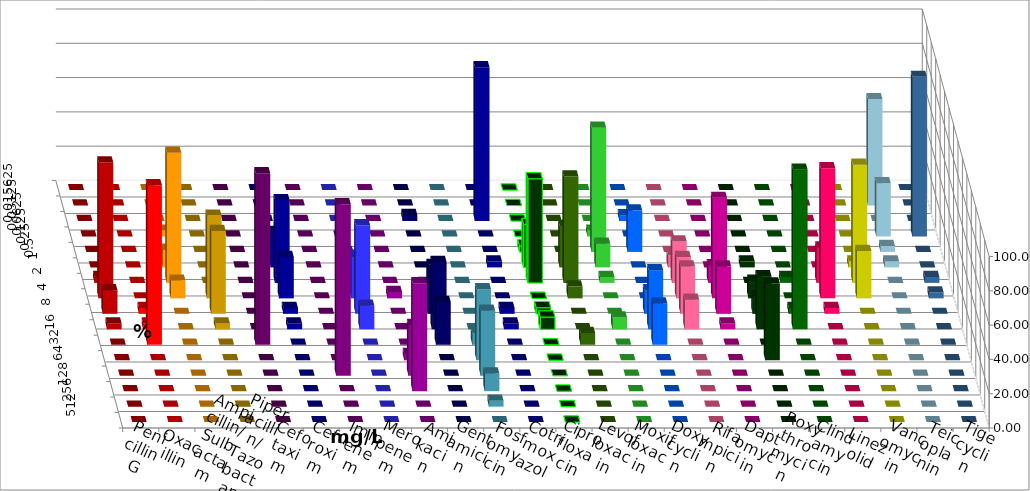
| Category | Penicillin G | Oxacillin | Ampicillin/ Sulbactam | Piperacillin/ Tazobactam | Cefotaxim | Cefuroxim | Imipenem | Meropenem | Amikacin | Gentamicin | Fosfomycin | Cotrimoxazol | Ciprofloxacin | Levofloxacin | Moxifloxacin | Doxycyclin | Rifampicin | Daptomycin | Roxythromycin | Clindamycin | Linezolid | Vancomycin | Teicoplanin | Tigecyclin |
|---|---|---|---|---|---|---|---|---|---|---|---|---|---|---|---|---|---|---|---|---|---|---|---|---|
| 0.015625 | 0 | 0 | 0 | 0 | 0 | 0 | 0 | 0 | 0 | 0 | 0 | 0 | 0 | 0 | 0 | 0 | 0 | 0 | 0 | 0 | 0 | 0 | 0 | 0 |
| 0.03125 | 0 | 0 | 0 | 0 | 0 | 0 | 0 | 0 | 0 | 0 | 0 | 0 | 0 | 0 | 0 | 0 | 0 | 0 | 0 | 0 | 0 | 0 | 0 | 62.069 |
| 0.0625 | 0 | 0 | 0 | 0 | 0 | 0 | 0 | 0 | 0 | 3.571 | 0 | 89.655 | 0 | 0 | 0 | 3.448 | 0 | 0 | 0 | 0 | 0 | 0 | 0 | 0 |
| 0.125 | 0 | 0 | 3.448 | 0 | 0 | 0 | 0 | 0 | 0 | 0 | 0 | 0 | 0 | 0 | 3.448 | 0 | 0 | 0 | 0 | 0 | 0 | 0 | 93.103 | 31.034 |
| 0.25 | 0 | 0 | 0 | 0 | 0 | 0 | 0 | 0 | 0 | 0 | 0 | 0 | 3.571 | 0 | 72.414 | 24.138 | 0 | 0 | 0 | 0 | 0 | 0 | 0 | 3.448 |
| 0.5 | 0 | 0 | 10.345 | 0 | 0 | 0 | 20.69 | 6.897 | 0 | 0 | 0 | 3.448 | 25 | 24.138 | 13.793 | 0 | 6.897 | 0 | 3.448 | 0 | 0 | 3.448 | 0 | 3.448 |
| 1.0 | 3.448 | 0 | 75.862 | 0 | 0 | 0 | 48.276 | 3.448 | 0 | 0 | 0 | 0 | 60.714 | 62.069 | 3.448 | 0 | 24.138 | 10.345 | 0 | 3.448 | 20.69 | 68.966 | 3.448 | 0 |
| 2.0 | 79.31 | 0 | 10.345 | 48.276 | 0 | 0 | 24.138 | 24.138 | 3.704 | 3.571 | 0 | 0 | 0 | 6.897 | 0 | 0 | 24.138 | 58.621 | 10.345 | 0 | 75.862 | 27.586 | 3.448 | 0 |
| 4.0 | 13.793 | 3.448 | 0 | 48.276 | 0 | 0 | 3.448 | 51.724 | 0 | 28.571 | 0 | 3.448 | 3.571 | 0 | 0 | 13.793 | 27.586 | 27.586 | 10.345 | 3.448 | 3.448 | 0 | 0 | 0 |
| 8.0 | 3.448 | 3.448 | 0 | 3.448 | 0 | 0 | 3.448 | 13.793 | 0 | 39.286 | 0 | 3.448 | 7.143 | 0 | 6.897 | 34.483 | 17.241 | 3.448 | 31.034 | 93.103 | 0 | 0 | 0 | 0 |
| 16.0 | 0 | 93.103 | 0 | 0 | 100 | 0 | 0 | 0 | 0 | 25 | 6.897 | 0 | 0 | 6.897 | 0 | 24.138 | 0 | 0 | 0 | 0 | 0 | 0 | 0 | 0 |
| 32.0 | 0 | 0 | 0 | 0 | 0 | 0 | 0 | 0 | 3.704 | 0 | 41.379 | 0 | 0 | 0 | 0 | 0 | 0 | 0 | 44.828 | 0 | 0 | 0 | 0 | 0 |
| 64.0 | 0 | 0 | 0 | 0 | 0 | 100 | 0 | 0 | 29.63 | 0 | 37.931 | 0 | 0 | 0 | 0 | 0 | 0 | 0 | 0 | 0 | 0 | 0 | 0 | 0 |
| 128.0 | 0 | 0 | 0 | 0 | 0 | 0 | 0 | 0 | 62.963 | 0 | 10.345 | 0 | 0 | 0 | 0 | 0 | 0 | 0 | 0 | 0 | 0 | 0 | 0 | 0 |
| 256.0 | 0 | 0 | 0 | 0 | 0 | 0 | 0 | 0 | 0 | 0 | 3.448 | 0 | 0 | 0 | 0 | 0 | 0 | 0 | 0 | 0 | 0 | 0 | 0 | 0 |
| 512.0 | 0 | 0 | 0 | 0 | 0 | 0 | 0 | 0 | 0 | 0 | 0 | 0 | 0 | 0 | 0 | 0 | 0 | 0 | 0 | 0 | 0 | 0 | 0 | 0 |